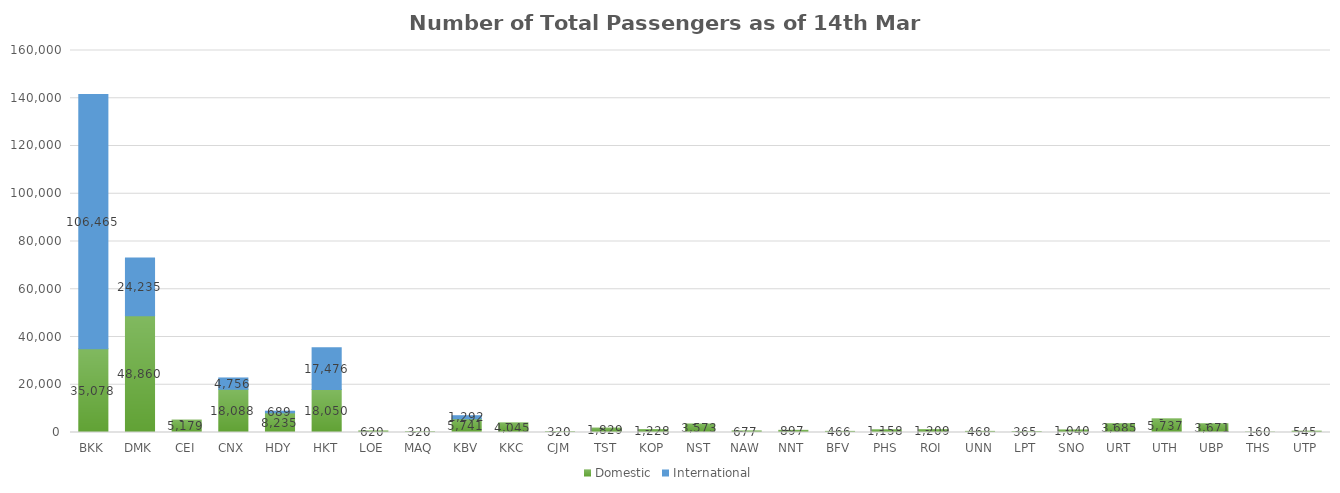
| Category | Domestic | International |
|---|---|---|
| BKK | 35078 | 106465 |
| DMK | 48860 | 24235 |
| CEI | 5179 | 0 |
| CNX | 18088 | 4756 |
| HDY | 8235 | 689 |
| HKT | 18050 | 17476 |
| LOE | 620 | 0 |
| MAQ | 320 | 0 |
| KBV | 5741 | 1292 |
| KKC | 4045 | 0 |
| CJM | 320 | 0 |
| TST | 1829 | 0 |
| KOP | 1228 | 0 |
| NST | 3573 | 0 |
| NAW | 677 | 0 |
| NNT | 897 | 0 |
| BFV | 466 | 0 |
| PHS | 1158 | 0 |
| ROI | 1209 | 0 |
| UNN | 468 | 0 |
| LPT | 365 | 0 |
| SNO | 1040 | 0 |
| URT | 3685 | 0 |
| UTH | 5737 | 0 |
| UBP | 3671 | 0 |
| THS | 160 | 0 |
| UTP | 545 | 0 |